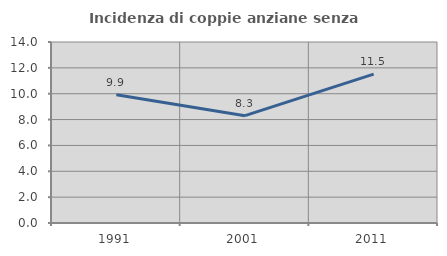
| Category | Incidenza di coppie anziane senza figli  |
|---|---|
| 1991.0 | 9.917 |
| 2001.0 | 8.302 |
| 2011.0 | 11.517 |